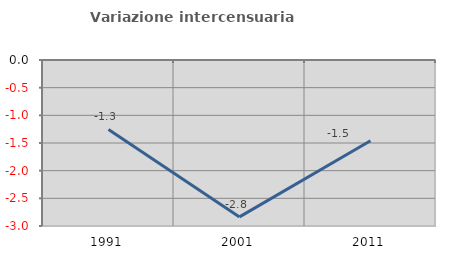
| Category | Variazione intercensuaria annua |
|---|---|
| 1991.0 | -1.255 |
| 2001.0 | -2.836 |
| 2011.0 | -1.46 |